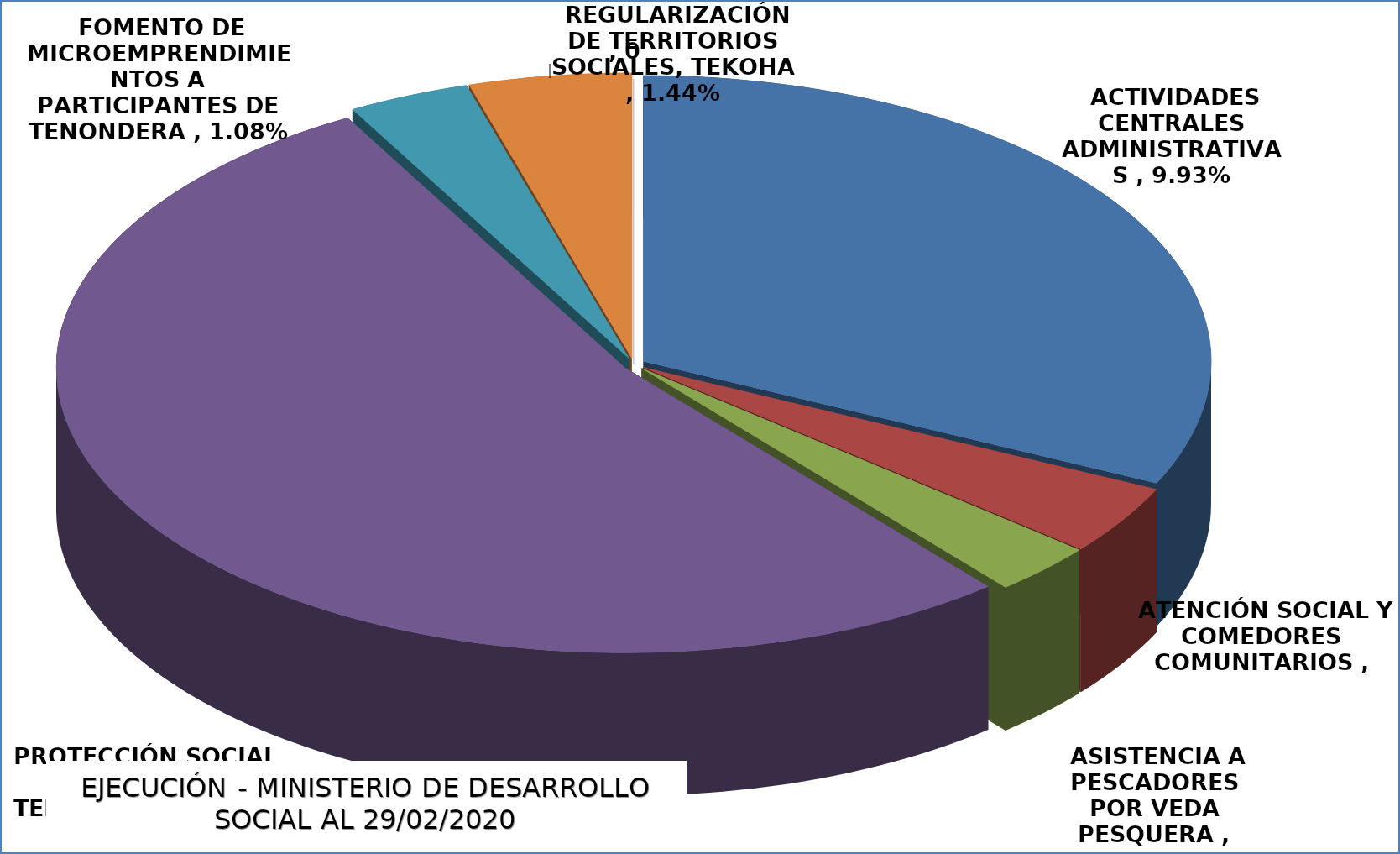
| Category | EJECUCIÓN - MINISTERIO DE DESARROLLO SOCIAL |
|---|---|
| ACTIVIDADES CENTRALES ADMINISTRATIVAS | 0.099 |
| ATENCIÓN SOCIAL Y COMEDORES COMUNITARIOS | 0.012 |
| ASISTENCIA A PESCADORES POR VEDA PESQUERA | 0.009 |
| PROTECCIÓN SOCIAL A FAMILIAS DE TEKOPORA | 0.164 |
| FOMENTO DE MICROEMPRENDIMIENTOS A PARTICIPANTES DE TENONDERA | 0.011 |
| REGULARIZACIÓN DE TERRITORIOS SOCIALES, TEKOHA | 0.014 |